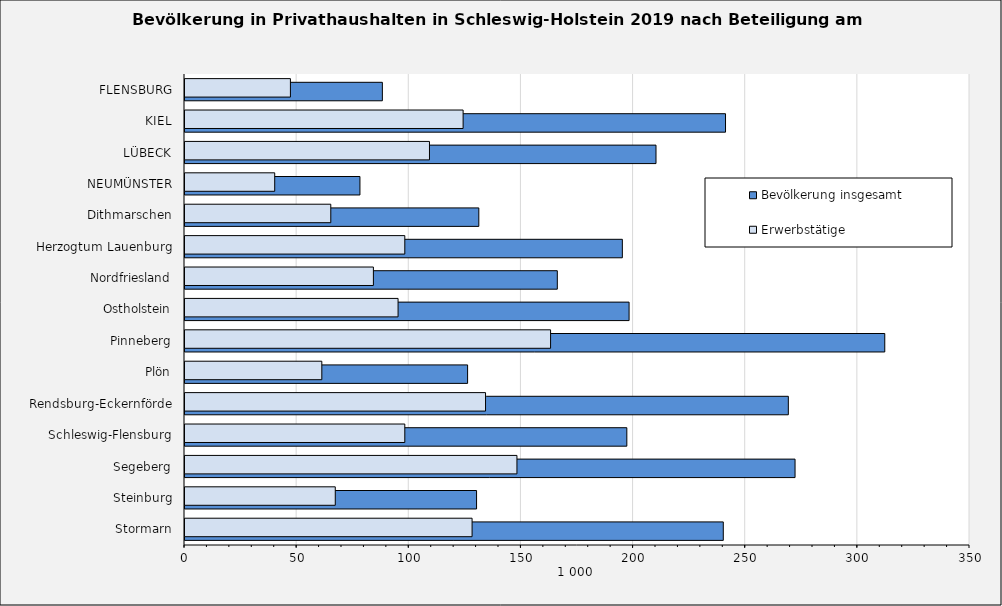
| Category | Bevölkerung insgesamt | Erwerbstätige |
|---|---|---|
| Stormarn | 240 | 128 |
| Steinburg | 130 | 67 |
| Segeberg | 272 | 148 |
| Schleswig-Flensburg | 197 | 98 |
| Rendsburg-Eckernförde | 269 | 134 |
| Plön | 126 | 61 |
| Pinneberg | 312 | 163 |
| Ostholstein | 198 | 95 |
| Nordfriesland | 166 | 84 |
| Herzogtum Lauenburg | 195 | 98 |
| Dithmarschen | 131 | 65 |
| NEUMÜNSTER | 78 | 40 |
| LÜBECK | 210 | 109 |
| KIEL | 241 | 124 |
| FLENSBURG | 88 | 47 |